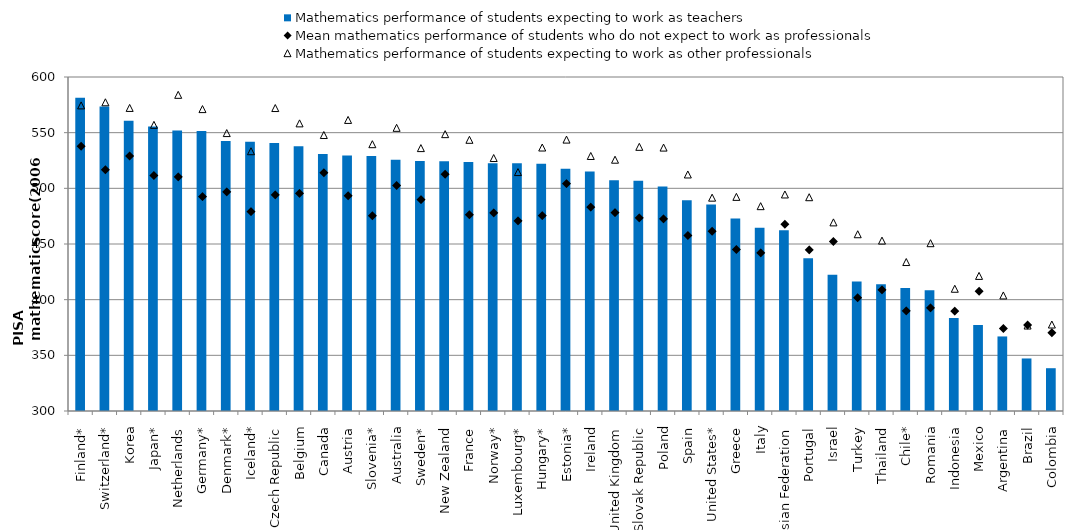
| Category | Mathematics performance of students expecting to work as teachers |
|---|---|
| Finland* | 581.413 |
| Switzerland* | 573.44 |
| Korea | 560.684 |
| Japan* | 555.439 |
| Netherlands | 552.035 |
| Germany* | 551.44 |
| Denmark* | 542.585 |
| Iceland* | 541.942 |
| Czech Republic | 540.67 |
| Belgium | 537.874 |
| Canada | 530.823 |
| Austria | 529.391 |
| Slovenia* | 529.02 |
| Australia | 525.657 |
| Sweden* | 524.453 |
| New Zealand | 524.334 |
| France | 523.634 |
| Norway* | 522.593 |
| Luxembourg* | 522.552 |
| Hungary* | 522.017 |
| Estonia* | 517.547 |
| Ireland | 515.069 |
| United Kingdom | 507.187 |
| Slovak Republic | 506.809 |
| Poland | 501.569 |
| Spain | 489.327 |
| United States* | 485.369 |
| Greece | 473.01 |
| Italy | 464.59 |
| Russian Federation | 462.341 |
| Portugal | 437.127 |
| Israel | 422.365 |
| Turkey | 416.29 |
| Thailand | 413.85 |
| Chile* | 410.543 |
| Romania | 408.459 |
| Indonesia | 383.636 |
| Mexico | 377.25 |
| Argentina | 366.969 |
| Brazil | 347.183 |
| Colombia | 338.436 |